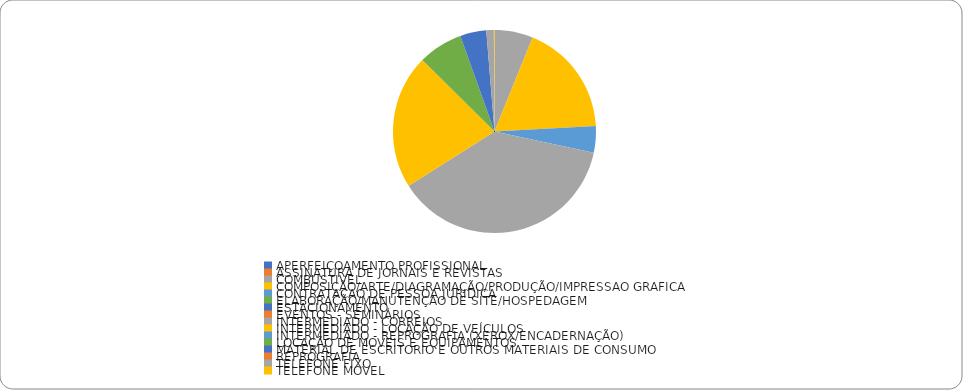
| Category | Series 0 |
|---|---|
| APERFEIÇOAMENTO PROFISSIONAL | 0 |
| ASSINATURA DE JORNAIS E REVISTAS | 0 |
| COMBUSTIVEL | 5388.06 |
| COMPOSIÇÃO/ARTE/DIAGRAMAÇÃO/PRODUÇÃO/IMPRESSAO GRAFICA | 15828.733 |
| CONTRATAÇAO DE PESSOA JURIDICA | 3726.667 |
| ELABORAÇÃO/MANUTENÇAO DE SITE/HOSPEDAGEM | 0 |
| ESTACIONAMENTO | 0 |
| EVENTOS - SEMINÁRIOS | 0 |
| INTERMEDIADO - CORREIOS | 33131.023 |
| INTERMEDIADO - LOCAÇÃO DE VEÍCULOS | 18820.803 |
| INTERMEDIADO - REPROGRAFIA (XEROX/ENCADERNAÇÃO) | 0.133 |
| LOCAÇÃO DE MOVEIS E EQUIPAMENTOS | 6260 |
| MATERIAL DE ESCRITORIO E OUTROS MATERIAIS DE CONSUMO | 3663.093 |
| REPROGRAFIA | 0 |
| TELEFONE FIXO | 1049.323 |
| TELEFONE MOVEL | 89.93 |